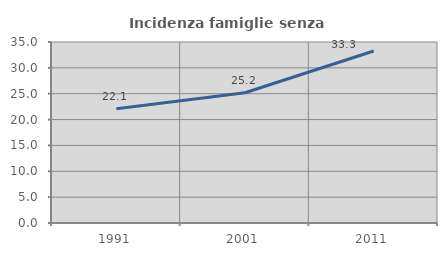
| Category | Incidenza famiglie senza nuclei |
|---|---|
| 1991.0 | 22.071 |
| 2001.0 | 25.182 |
| 2011.0 | 33.25 |